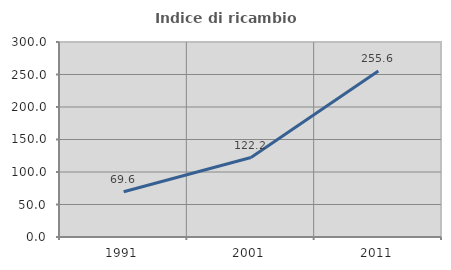
| Category | Indice di ricambio occupazionale  |
|---|---|
| 1991.0 | 69.643 |
| 2001.0 | 122.222 |
| 2011.0 | 255.556 |